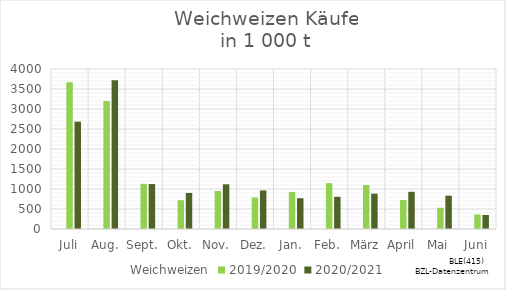
| Category | Weichweizen | 2019/2020 | 2020/2021 |
|---|---|---|---|
| Juli |  | 3666.99 | 2683.263 |
| Aug. |  | 3201.082 | 3719.017 |
| Sept. |  | 1129.507 | 1123.745 |
| Okt. |  | 720.345 | 901.767 |
| Nov. |  | 949.609 | 1118.196 |
| Dez. |  | 787.183 | 963.701 |
| Jan. |  | 927.401 | 768.938 |
| Feb. |  | 1146.834 | 804.226 |
| März |  | 1098.966 | 884.093 |
| April |  | 725.658 | 930.017 |
| Mai |  | 531.293 | 834.083 |
| Juni |  | 362.521 | 350.161 |